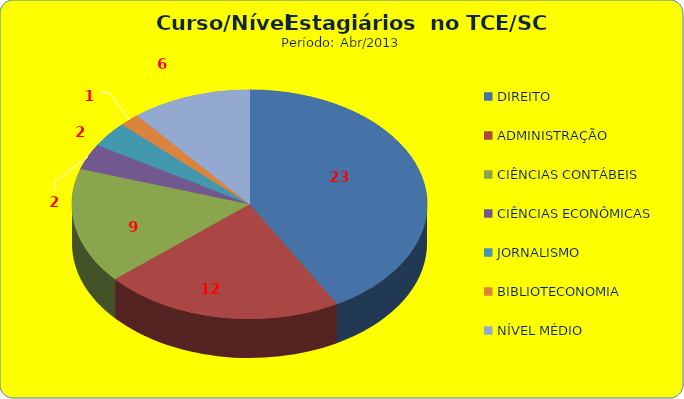
| Category | Series 0 |
|---|---|
| DIREITO | 23 |
| ADMINISTRAÇÃO | 12 |
| CIÊNCIAS CONTÁBEIS | 9 |
| CIÊNCIAS ECONÔMICAS | 2 |
| JORNALISMO | 2 |
| BIBLIOTECONOMIA | 1 |
| NÍVEL MÉDIO | 6 |